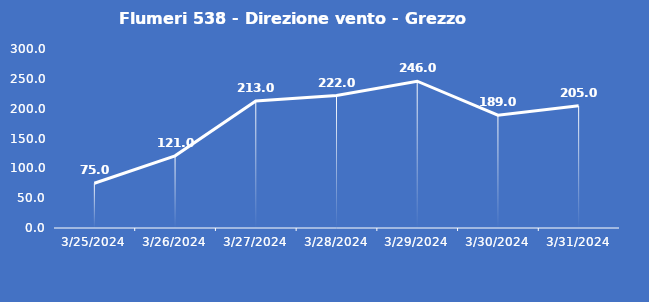
| Category | Flumeri 538 - Direzione vento - Grezzo (°N) |
|---|---|
| 3/25/24 | 75 |
| 3/26/24 | 121 |
| 3/27/24 | 213 |
| 3/28/24 | 222 |
| 3/29/24 | 246 |
| 3/30/24 | 189 |
| 3/31/24 | 205 |